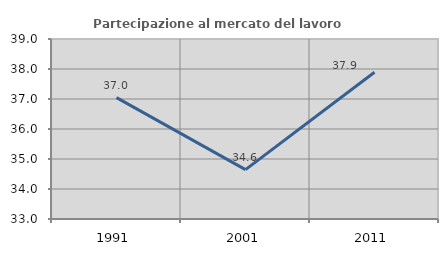
| Category | Partecipazione al mercato del lavoro  femminile |
|---|---|
| 1991.0 | 37.045 |
| 2001.0 | 34.647 |
| 2011.0 | 37.89 |